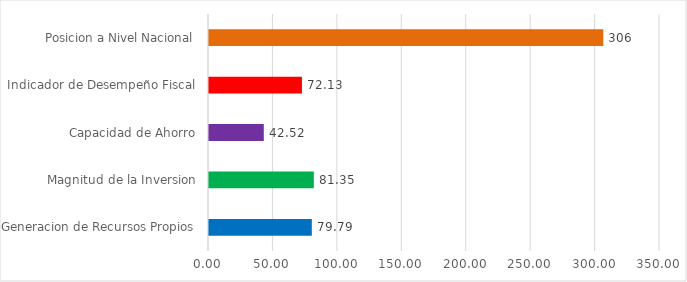
| Category | Series 0 |
|---|---|
| Generacion de Recursos Propios | 79.79 |
| Magnitud de la Inversion | 81.35 |
| Capacidad de Ahorro | 42.52 |
| Indicador de Desempeño Fiscal | 72.13 |
| Posicion a Nivel Nacional | 306 |